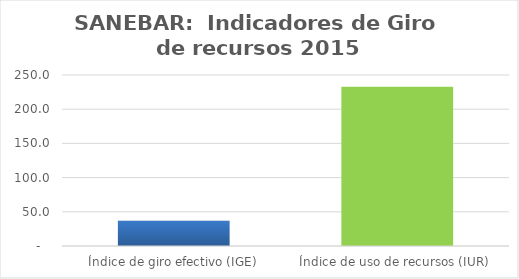
| Category | Series 0 |
|---|---|
| Índice de giro efectivo (IGE) | 37.065 |
| Índice de uso de recursos (IUR)  | 232.769 |